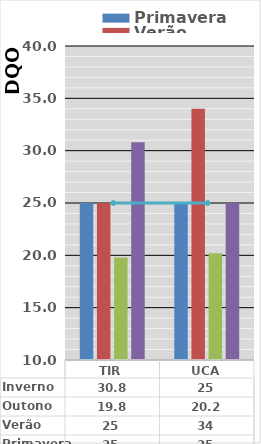
| Category | Primavera | Verão | Outono | Inverno |
|---|---|---|---|---|
| TIR | 25 | 25 | 19.8 | 30.8 |
| UCA | 25 | 34 | 20.2 | 25 |